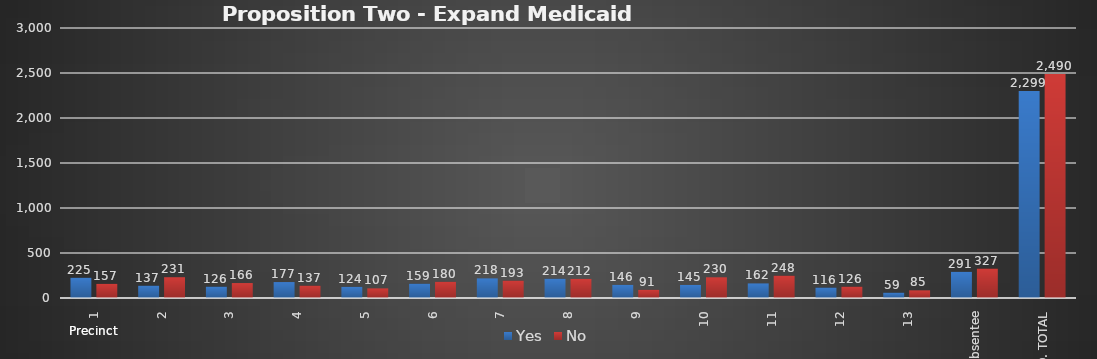
| Category | Yes | No |
|---|---|---|
| 1 | 225 | 157 |
| 2 | 137 | 231 |
| 3 | 126 | 166 |
| 4 | 177 | 137 |
| 5 | 124 | 107 |
| 6 | 159 | 180 |
| 7 | 218 | 193 |
| 8 | 214 | 212 |
| 9 | 146 | 91 |
| 10 | 145 | 230 |
| 11 | 162 | 248 |
| 12 | 116 | 126 |
| 13 | 59 | 85 |
| Absentee | 291 | 327 |
| CO. TOTAL | 2299 | 2490 |